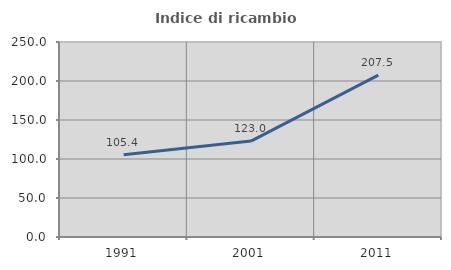
| Category | Indice di ricambio occupazionale  |
|---|---|
| 1991.0 | 105.381 |
| 2001.0 | 122.979 |
| 2011.0 | 207.456 |